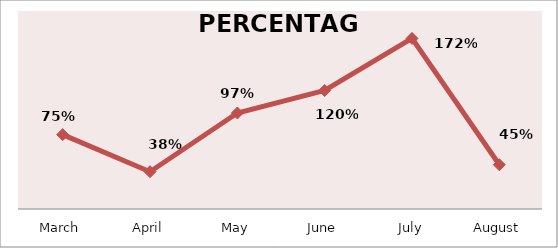
| Category | PERCENTAGE |
|---|---|
| March | 0.751 |
| April | 0.377 |
| May | 0.97 |
| June | 1.197 |
| July | 1.723 |
| August | 0.447 |